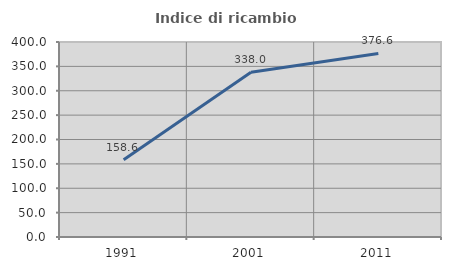
| Category | Indice di ricambio occupazionale  |
|---|---|
| 1991.0 | 158.571 |
| 2001.0 | 338 |
| 2011.0 | 376.562 |